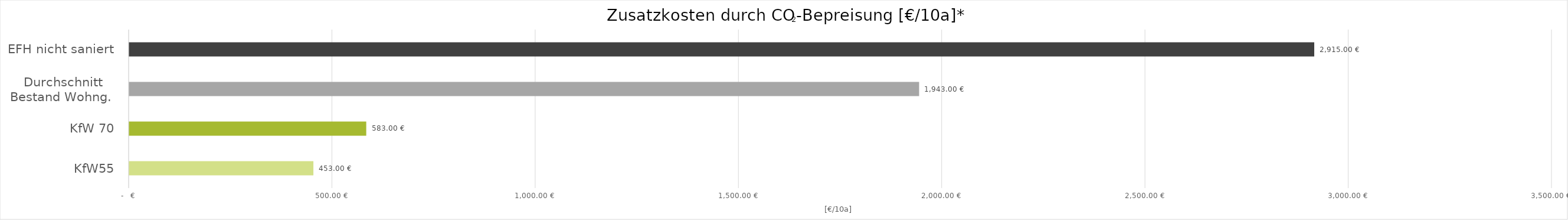
| Category | Zusatzkosten durch CO2-Bepreisung [€/10a] |
|---|---|
| KfW55 | 453 |
| KfW 70 | 583 |
| Durchschnitt
Bestand Wohng.  | 1943 |
| EFH nicht saniert | 2915 |